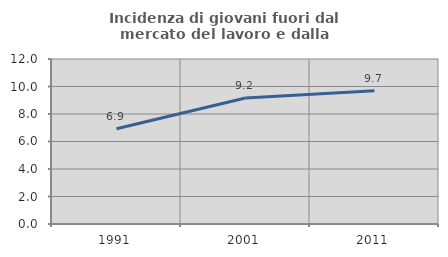
| Category | Incidenza di giovani fuori dal mercato del lavoro e dalla formazione  |
|---|---|
| 1991.0 | 6.925 |
| 2001.0 | 9.162 |
| 2011.0 | 9.699 |